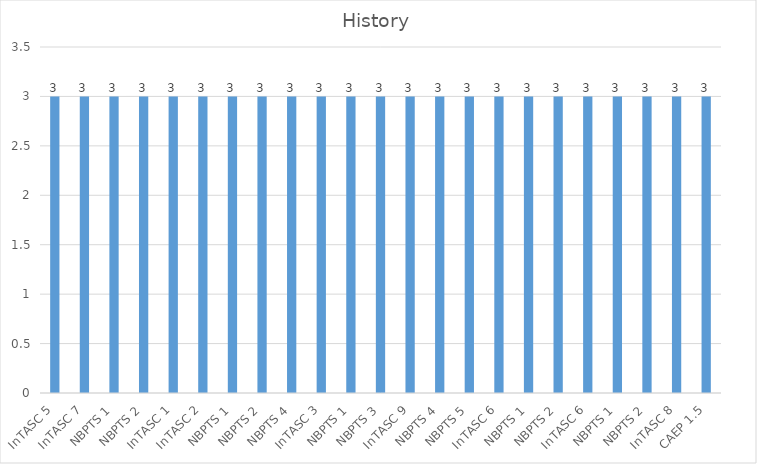
| Category | History |
|---|---|
| InTASC 5 | 3 |
| InTASC 7 | 3 |
| NBPTS 1 | 3 |
| NBPTS 2 | 3 |
| InTASC 1 | 3 |
| InTASC 2 | 3 |
| NBPTS 1 | 3 |
| NBPTS 2 | 3 |
| NBPTS 4 | 3 |
| InTASC 3 | 3 |
| NBPTS 1 | 3 |
| NBPTS 3 | 3 |
| InTASC 9 | 3 |
| NBPTS 4 | 3 |
| NBPTS 5 | 3 |
| InTASC 6 | 3 |
| NBPTS 1 | 3 |
| NBPTS 2 | 3 |
| InTASC 6 | 3 |
| NBPTS 1 | 3 |
| NBPTS 2 | 3 |
| InTASC 8 | 3 |
| CAEP 1.5 | 3 |